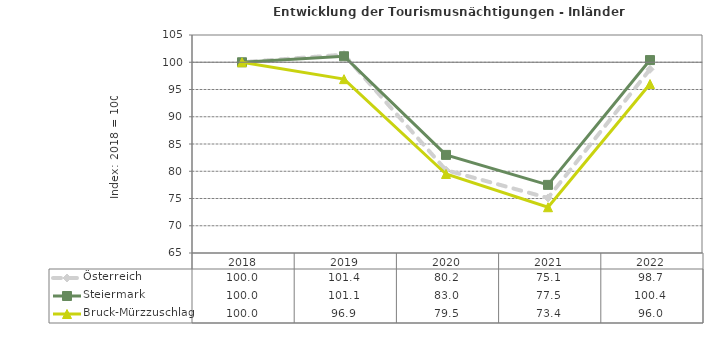
| Category | Österreich | Steiermark | Bruck-Mürzzuschlag |
|---|---|---|---|
| 2022.0 | 98.7 | 100.4 | 96 |
| 2021.0 | 75.1 | 77.5 | 73.4 |
| 2020.0 | 80.2 | 83 | 79.5 |
| 2019.0 | 101.4 | 101.1 | 96.9 |
| 2018.0 | 100 | 100 | 100 |